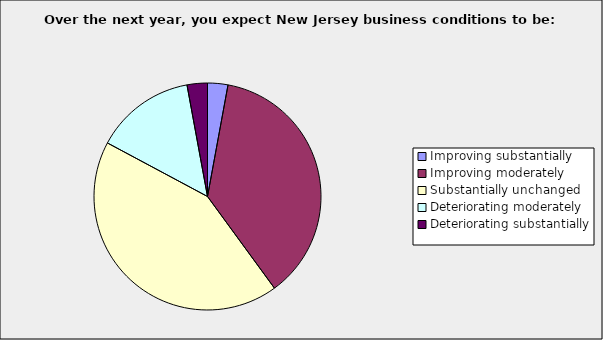
| Category | Series 0 |
|---|---|
| Improving substantially | 0.029 |
| Improving moderately | 0.371 |
| Substantially unchanged | 0.429 |
| Deteriorating moderately | 0.143 |
| Deteriorating substantially | 0.029 |